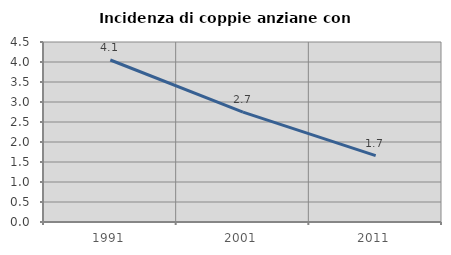
| Category | Incidenza di coppie anziane con figli |
|---|---|
| 1991.0 | 4.05 |
| 2001.0 | 2.748 |
| 2011.0 | 1.66 |